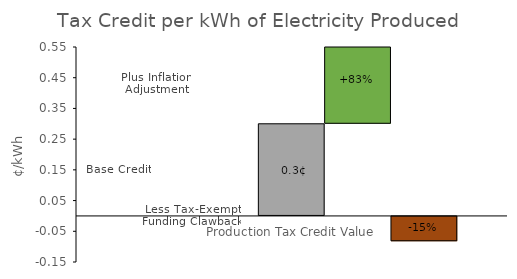
| Category | Space 1 | Space 2 | Base Credit | Plus Inflation Adjustment | Less Tax-Exempt Funding Clawback |
|---|---|---|---|---|---|
| 0 | 0 | 0 | 0.3 | 0.25 | -0.082 |